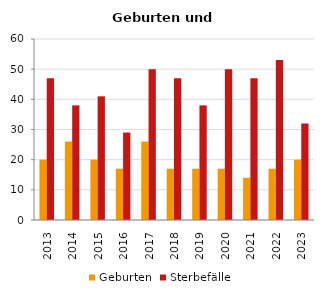
| Category | Geburten | Sterbefälle |
|---|---|---|
| 2013.0 | 20 | 47 |
| 2014.0 | 26 | 38 |
| 2015.0 | 20 | 41 |
| 2016.0 | 17 | 29 |
| 2017.0 | 26 | 50 |
| 2018.0 | 17 | 47 |
| 2019.0 | 17 | 38 |
| 2020.0 | 17 | 50 |
| 2021.0 | 14 | 47 |
| 2022.0 | 17 | 53 |
| 2023.0 | 20 | 32 |